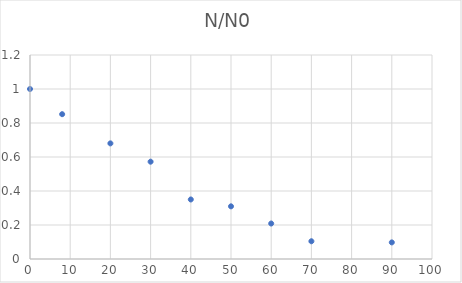
| Category | N/N0 |
|---|---|
| 0.0 | 1 |
| 8.0 | 0.852 |
| 20.0 | 0.68 |
| 30.0 | 0.572 |
| 40.0 | 0.35 |
| 50.0 | 0.31 |
| 60.0 | 0.209 |
| 70.0 | 0.104 |
| 90.0 | 0.098 |